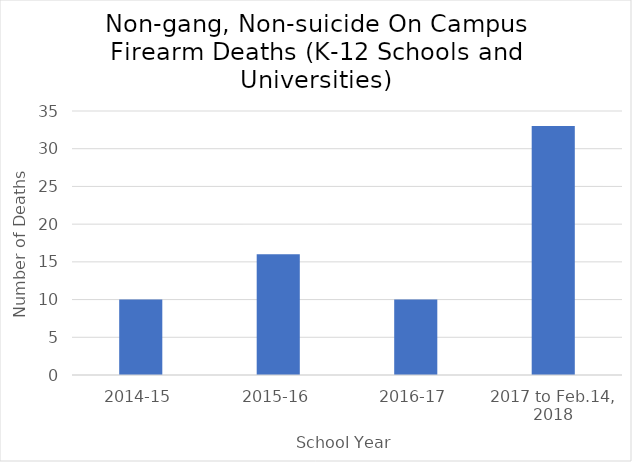
| Category | K12 and Universities |
|---|---|
| 2014-15 | 10 |
| 2015-16 | 16 |
| 2016-17 | 10 |
| 2017 to Feb.14, 2018 | 33 |